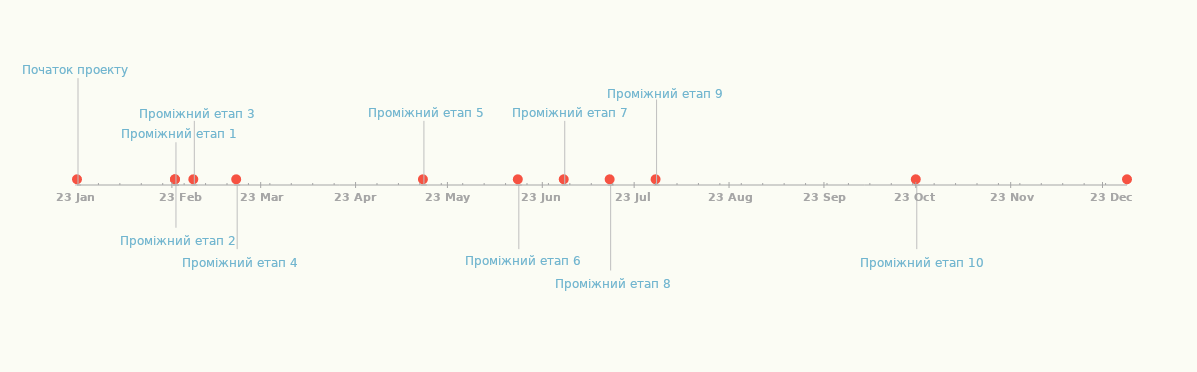
| Category | РОЗТАШУВАННЯ |
|---|---|
| Початок проекту | 25 |
| Проміжний етап 1 | 10 |
| Проміжний етап 2 | -10 |
| Проміжний етап 3 | 15 |
| Проміжний етап 4 | -15 |
| Проміжний етап 5 | 15 |
| Проміжний етап 6 | -15 |
| Проміжний етап 7 | 15 |
| Проміжний етап 8 | -20 |
| Проміжний етап 9 | 20 |
| Проміжний етап 10 | -15 |
| Завершення проекту | 15 |